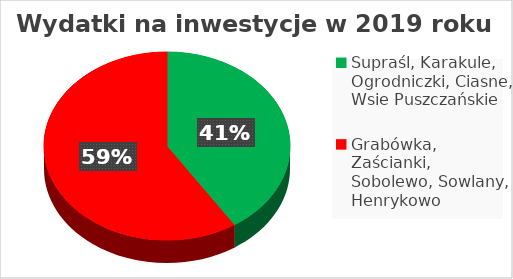
| Category | Series 0 |
|---|---|
| Supraśl, Karakule, Ogrodniczki, Ciasne, Wsie Puszczańskie | 8048405.17 |
| Grabówka, Zaścianki, Sobolewo, Sowlany, Henrykowo | 11684998.63 |